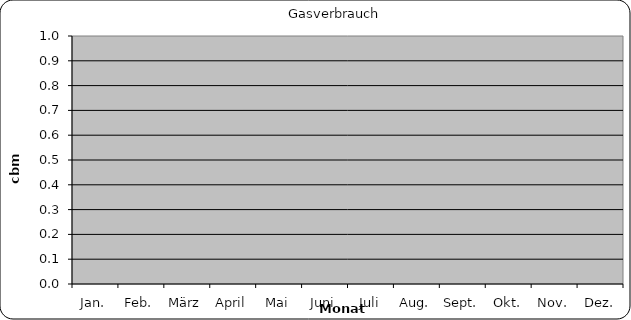
| Category | Gasverbrauch |
|---|---|
| Jan. | 0 |
| Feb. | 0 |
| März | 0 |
| April | 0 |
| Mai | 0 |
| Juni | 0 |
| Juli | 0 |
| Aug. | 0 |
| Sept. | 0 |
| Okt. | 0 |
| Nov. | 0 |
| Dez. | 0 |